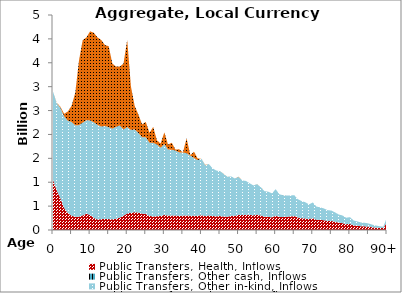
| Category | Public Transfers, Health, Inflows | Public Transfers, Other cash, Inflows | Public Transfers, Other in-kind, Inflows | Public Transfers, Education, Inflows |
|---|---|---|---|---|
| 0 | 1052.669 |  | 1842.281 | 0 |
|  | 830.897 |  | 1826.668 | 6.875 |
| 2 | 663.395 |  | 1892.662 | 21.88 |
| 3 | 463.126 |  | 1916.609 | 52.154 |
| 4 | 356.403 |  | 1929.416 | 195.473 |
| 5 | 300.4 |  | 1962.083 | 335.61 |
| 6 | 274.296 |  | 1915.083 | 680.984 |
| 7 | 279.563 |  | 1916.327 | 1350.803 |
| 8 | 305.872 |  | 1939.259 | 1728.104 |
| 9 | 339.216 |  | 1957.402 | 1733.906 |
| 10 | 314.381 |  | 1978.736 | 1865.324 |
| 11 | 253.811 |  | 2001.152 | 1873.445 |
| 12 | 220.105 |  | 1979.878 | 1830.864 |
| 13 | 225.625 |  | 1938.641 | 1812.929 |
| 14 | 233.839 |  | 1942.907 | 1694.602 |
| 15 | 228.247 |  | 1923.81 | 1695.269 |
| 16 | 223.279 |  | 1896.323 | 1363.093 |
| 17 | 238.745 |  | 1919.329 | 1261.707 |
| 18 | 259.741 |  | 1929.323 | 1230.759 |
| 19 | 300.129 |  | 1803.438 | 1380.58 |
| 20 | 346.724 |  | 1809.42 | 1821.733 |
| 21 | 359.337 |  | 1735.099 | 909.184 |
| 22 | 374.28 |  | 1730.804 | 495.062 |
| 23 | 364.919 |  | 1667.047 | 387.159 |
| 24 | 343.005 |  | 1598.595 | 269.707 |
| 25 | 335.459 |  | 1605.904 | 321.309 |
| 26 | 295.757 |  | 1530.324 | 207.17 |
| 27 | 283.782 |  | 1540.552 | 333.053 |
| 28 | 289.221 |  | 1500.608 | 87.879 |
| 29 | 294.359 |  | 1427.834 | 87.357 |
| 30 | 317.067 |  | 1480.807 | 247.04 |
| 31 | 302.228 |  | 1380.931 | 103.364 |
| 32 | 305.218 |  | 1376.081 | 146.174 |
| 33 | 303.547 |  | 1358.179 | 21.506 |
| 34 | 296.628 |  | 1328.014 | 65.626 |
| 35 | 302.028 |  | 1318.707 | 1.685 |
| 36 | 305.179 |  | 1302.039 | 313.084 |
| 37 | 298.298 |  | 1259.706 | 9.343 |
| 38 | 300.773 |  | 1207.959 | 129.486 |
| 39 | 300.268 |  | 1161.546 | 33.467 |
| 40 | 310.552 |  | 1181.616 | 0 |
| 41 | 289.815 |  | 1065.771 | 7.62 |
| 42 | 304.487 |  | 1075.975 | 0 |
| 43 | 291.757 |  | 999.441 | 0 |
| 44 | 288.107 |  | 956.584 | 0 |
| 45 | 291.385 |  | 941.659 | 0 |
| 46 | 282.076 |  | 890.799 | 2.729 |
| 47 | 278.959 |  | 834.838 | 0.977 |
| 48 | 295.58 |  | 826.669 | 0 |
| 49 | 295.741 |  | 782.902 | 0 |
| 50 | 318.847 |  | 790.669 | 5.912 |
| 51 | 311.959 |  | 726.654 | 0 |
| 52 | 320.638 |  | 705.63 | 0 |
| 53 | 316.15 |  | 661.599 | 0 |
| 54 | 307.753 |  | 625.764 | 0 |
| 55 | 321.08 |  | 637.77 | 1.868 |
| 56 | 303.462 |  | 591.221 | 0 |
| 57 | 278 |  | 534.499 | 1.371 |
| 58 | 274.596 |  | 527.03 | 0 |
| 59 | 264.189 |  | 503.064 | 0 |
| 60 | 299.272 |  | 555.3 | 0 |
| 61 | 270.514 |  | 477.732 | 0 |
| 62 | 270.195 |  | 456.499 | 1.58 |
| 63 | 277.52 |  | 444.358 | 0 |
| 64 | 284.343 |  | 437.54 | 0 |
| 65 | 292.85 |  | 437.218 | 0 |
| 66 | 260.549 |  | 382.41 | 0 |
| 67 | 247.574 |  | 357.501 | 0 |
| 68 | 242.284 |  | 338.289 | 0 |
| 69 | 227.399 |  | 308.418 | 0 |
| 70 | 249.302 |  | 327.852 | 0 |
| 71 | 215.081 |  | 275.059 | 0 |
| 72 | 211.593 |  | 262.846 | 0 |
| 73 | 204.147 |  | 246.657 | 0 |
| 74 | 190.801 |  | 223.925 | 0 |
| 75 | 190.006 |  | 217.418 | 0 |
| 76 | 173.477 |  | 195.518 | 0 |
| 77 | 152.771 |  | 171.367 | 0 |
| 78 | 143.809 |  | 160.402 | 0 |
| 79 | 122.053 |  | 134.689 | 0 |
| 80 | 128.935 |  | 140.14 | 0 |
| 81 | 97.097 |  | 103.35 | 0 |
| 82 | 88.399 |  | 91.315 | 0 |
| 83 | 79.297 |  | 79.466 | 0 |
| 84 | 76.34 |  | 74.705 | 0 |
| 85 | 69.978 |  | 67.395 | 0 |
| 86 | 58.226 |  | 55.305 | 0 |
| 87 | 48.957 |  | 44.818 | 0 |
| 88 | 43.215 |  | 36.707 | 0 |
| 89 | 38.723 |  | 29.33 | 0 |
| 90+ | 163.092 |  | 104.281 | 0 |